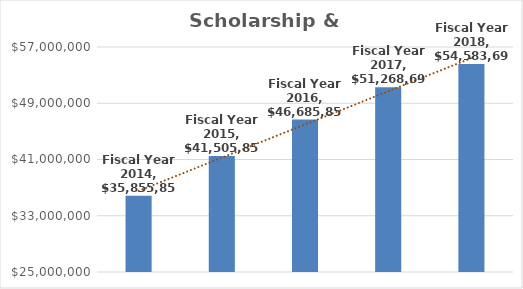
| Category | Scholarship & Fellowships |
|---|---|
| Fiscal Year 2014 | 35855853 |
| Fiscal Year 2015 | 41505853 |
| Fiscal Year 2016 | 46685853 |
| Fiscal Year 2017 | 51268693 |
| Fiscal Year 2018 | 54583693 |